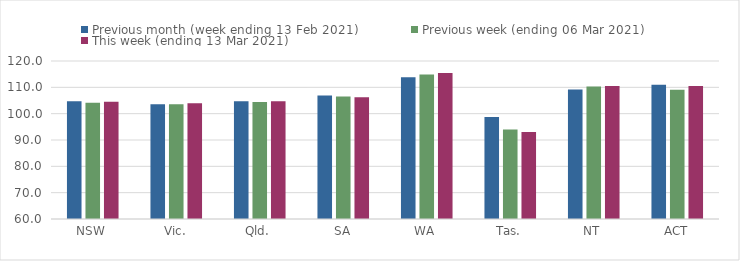
| Category | Previous month (week ending 13 Feb 2021) | Previous week (ending 06 Mar 2021) | This week (ending 13 Mar 2021) |
|---|---|---|---|
| NSW | 104.73 | 104.14 | 104.57 |
| Vic. | 103.56 | 103.58 | 103.94 |
| Qld. | 104.69 | 104.39 | 104.7 |
| SA | 106.89 | 106.5 | 106.28 |
| WA | 113.87 | 114.89 | 115.46 |
| Tas. | 98.76 | 93.99 | 93.05 |
| NT | 109.18 | 110.3 | 110.46 |
| ACT | 110.95 | 109.06 | 110.46 |